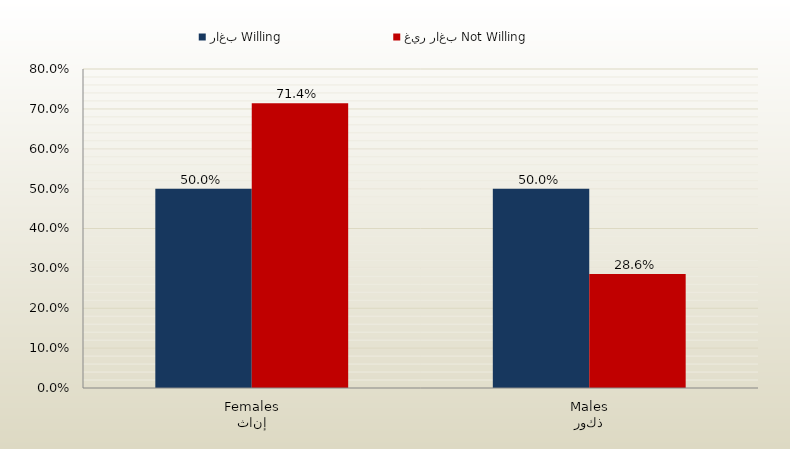
| Category | راغب Willing | غير راغب Not Willing |
|---|---|---|
| إناث
Females | 0.5 | 0.714 |
| ذكور
Males | 0.5 | 0.286 |